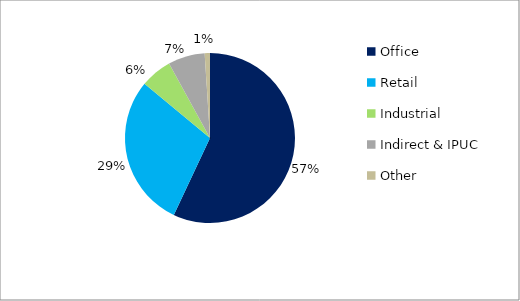
| Category | Series 0 |
|---|---|
| Office | 0.57 |
| Retail  | 0.29 |
| Industrial  | 0.06 |
| Indirect & IPUC | 0.07 |
| Other | 0.01 |